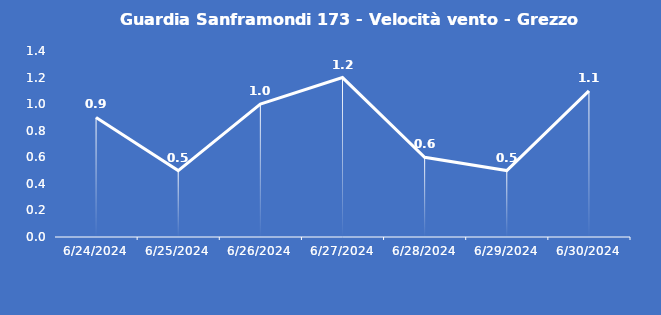
| Category | Guardia Sanframondi 173 - Velocità vento - Grezzo (m/s) |
|---|---|
| 6/24/24 | 0.9 |
| 6/25/24 | 0.5 |
| 6/26/24 | 1 |
| 6/27/24 | 1.2 |
| 6/28/24 | 0.6 |
| 6/29/24 | 0.5 |
| 6/30/24 | 1.1 |